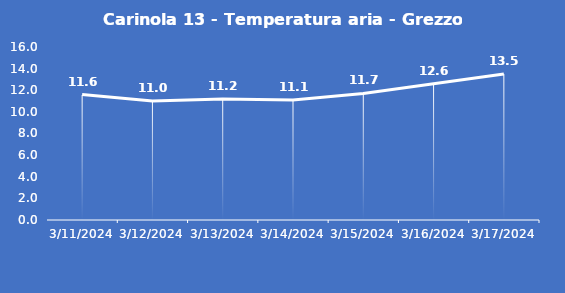
| Category | Carinola 13 - Temperatura aria - Grezzo (°C) |
|---|---|
| 3/11/24 | 11.6 |
| 3/12/24 | 11 |
| 3/13/24 | 11.2 |
| 3/14/24 | 11.1 |
| 3/15/24 | 11.7 |
| 3/16/24 | 12.6 |
| 3/17/24 | 13.5 |